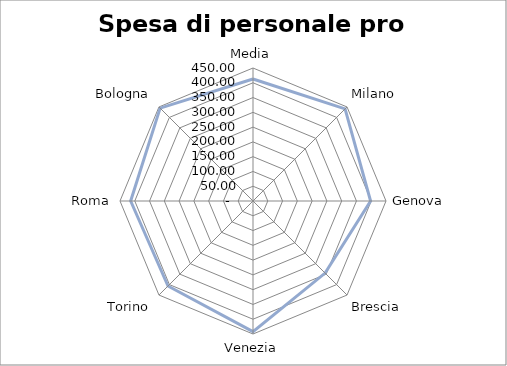
| Category | Spesa di personale pro capite  |
|---|---|
| Media | 412.951 |
| Milano | 440.64 |
| Genova | 397.88 |
| Brescia | 345.02 |
| Venezia | 442.05 |
| Torino | 406.78 |
| Roma | 413.9 |
| Bologna | 444.39 |